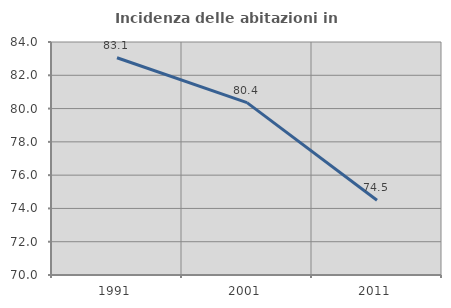
| Category | Incidenza delle abitazioni in proprietà  |
|---|---|
| 1991.0 | 83.056 |
| 2001.0 | 80.36 |
| 2011.0 | 74.487 |